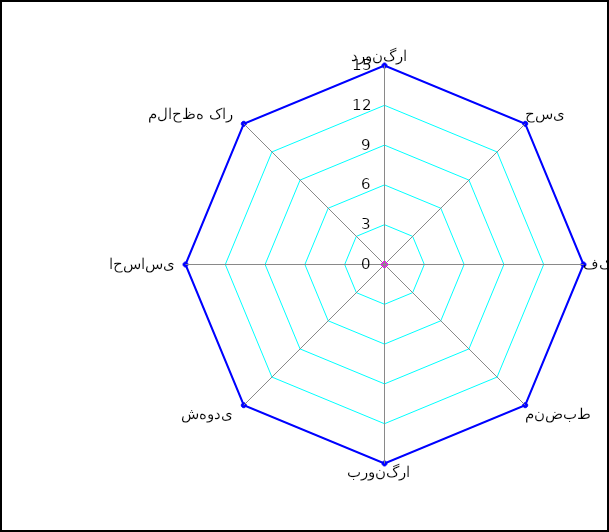
| Category | Series 0 | Series 1 |
|---|---|---|
| درونگرا  | 0 | 15 |
| حسی  | 0 | 15 |
| فکری | 0 | 15 |
| منضبط | 0 | 15 |
| برونگرا  | 0 | 15 |
| شهودی  | 0 | 15 |
| احساسی  | 0 | 15 |
| ملاحظه کار  | 0 | 15 |